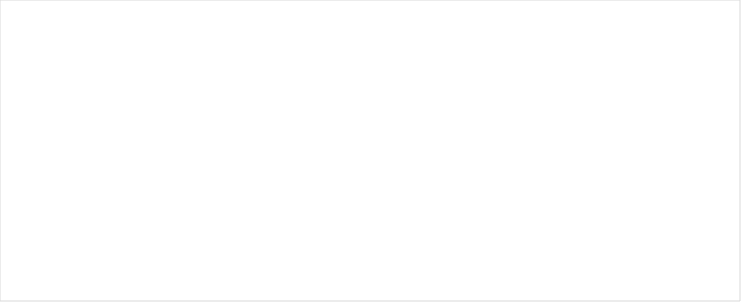
| Category | Total |
|---|---|
| Total | 1 |